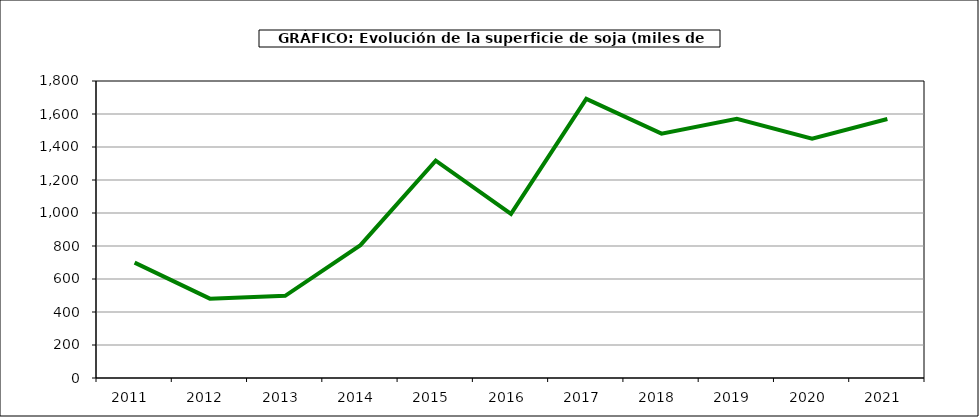
| Category | Superficie |
|---|---|
| 2011.0 | 699 |
| 2012.0 | 481 |
| 2013.0 | 498 |
| 2014.0 | 805 |
| 2015.0 | 1317 |
| 2016.0 | 995 |
| 2017.0 | 1692 |
| 2018.0 | 1481 |
| 2019.0 | 1571 |
| 2020.0 | 1450 |
| 2021.0 | 1570 |